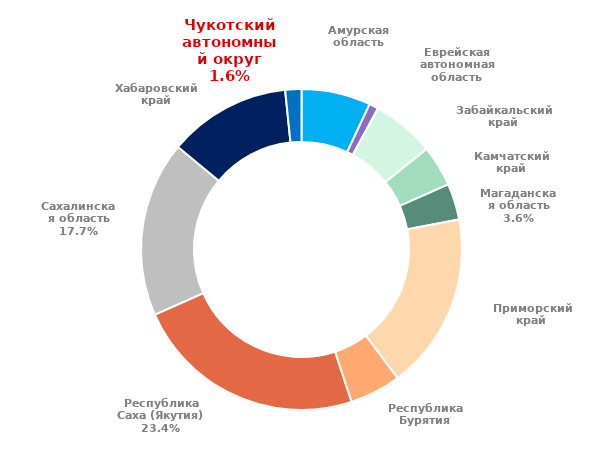
| Category | Итог |
|---|---|
| Амурская область | 603837326.192 |
| Еврейская автономная область | 80676231.827 |
| Забайкальский край | 547235633.572 |
| Камчатский край | 357183538.311 |
| Магаданская область | 315919119.166 |
| Приморский край | 1539350317.138 |
| Республика Бурятия | 447008536.588 |
| Республика Саха (Якутия) | 2025049385.773 |
| Сахалинская область | 1530380610.875 |
| Хабаровский край | 1067881505.793 |
| Чукотский автономный округ | 141042069.872 |